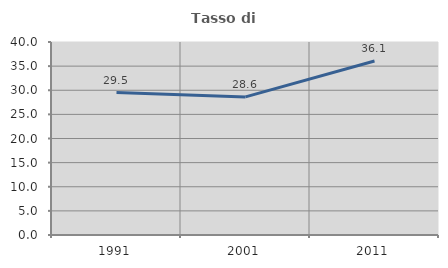
| Category | Tasso di occupazione   |
|---|---|
| 1991.0 | 29.509 |
| 2001.0 | 28.62 |
| 2011.0 | 36.064 |